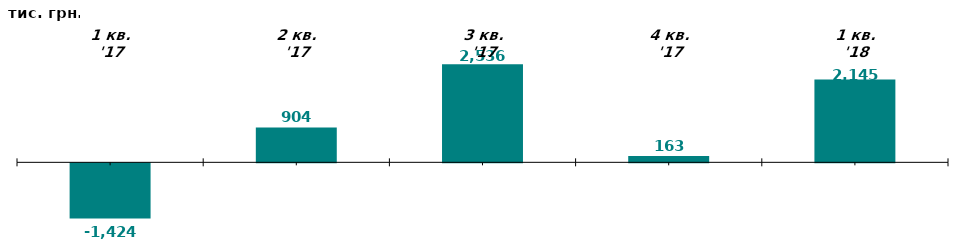
| Category | Чистий притік/відтік капіталу у 3-му кв. 2016-2017 рр., тис. грн. |
|---|---|
| 1 кв. '17 | -1423.808 |
| 2 кв. '17 | 903.571 |
| 3 кв. '17 | 2536.489 |
| 4 кв. '17 | 162.522 |
| 1 кв. '18 | 2145.214 |